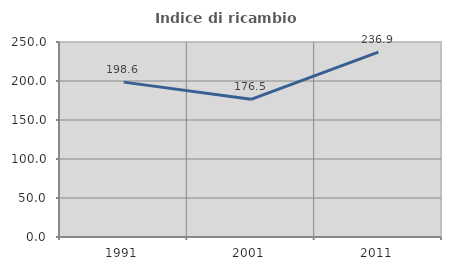
| Category | Indice di ricambio occupazionale  |
|---|---|
| 1991.0 | 198.571 |
| 2001.0 | 176.543 |
| 2011.0 | 236.923 |